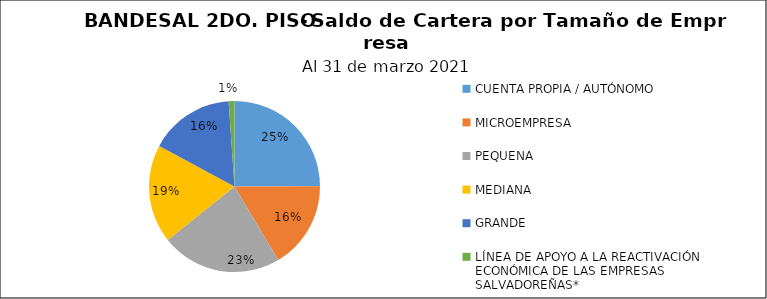
| Category | Saldo | Créditos |
|---|---|---|
| CUENTA PROPIA / AUTÓNOMO | 78.784 | 6121 |
| MICROEMPRESA | 52.177 | 6304 |
| PEQUENA | 72.121 | 1674 |
| MEDIANA | 58.817 | 356 |
| GRANDE | 50.636 | 177 |
| LÍNEA DE APOYO A LA REACTIVACIÓN ECONÓMICA DE LAS EMPRESAS SALVADOREÑAS* | 3.475 | 0 |